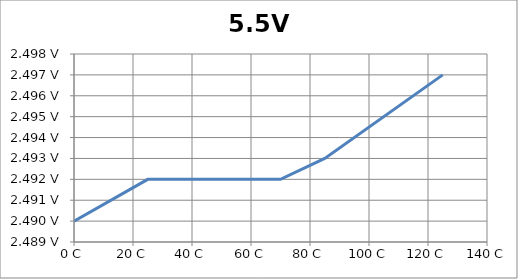
| Category | 5.5V 20mA |
|---|---|
| 0.0 | 2.49 |
| 25.0 | 2.492 |
| 70.0 | 2.492 |
| 85.0 | 2.493 |
| 125.0 | 2.497 |